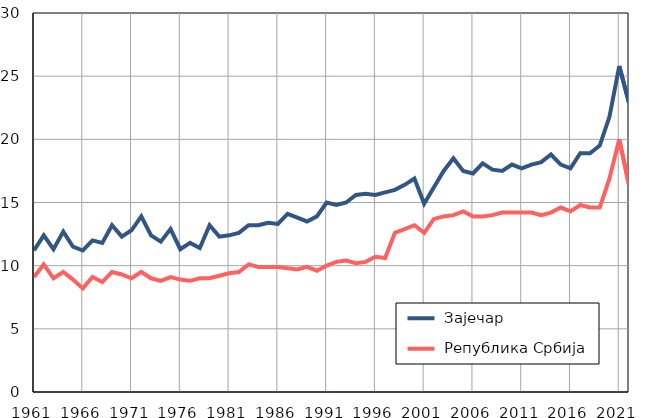
| Category |  Зајечар |  Република Србија |
|---|---|---|
| 1961.0 | 11.2 | 9.1 |
| 1962.0 | 12.4 | 10.1 |
| 1963.0 | 11.3 | 9 |
| 1964.0 | 12.7 | 9.5 |
| 1965.0 | 11.5 | 8.9 |
| 1966.0 | 11.2 | 8.2 |
| 1967.0 | 12 | 9.1 |
| 1968.0 | 11.8 | 8.7 |
| 1969.0 | 13.2 | 9.5 |
| 1970.0 | 12.3 | 9.3 |
| 1971.0 | 12.8 | 9 |
| 1972.0 | 13.9 | 9.5 |
| 1973.0 | 12.4 | 9 |
| 1974.0 | 11.9 | 8.8 |
| 1975.0 | 12.9 | 9.1 |
| 1976.0 | 11.3 | 8.9 |
| 1977.0 | 11.8 | 8.8 |
| 1978.0 | 11.4 | 9 |
| 1979.0 | 13.2 | 9 |
| 1980.0 | 12.3 | 9.2 |
| 1981.0 | 12.4 | 9.4 |
| 1982.0 | 12.6 | 9.5 |
| 1983.0 | 13.2 | 10.1 |
| 1984.0 | 13.2 | 9.9 |
| 1985.0 | 13.4 | 9.9 |
| 1986.0 | 13.3 | 9.9 |
| 1987.0 | 14.1 | 9.8 |
| 1988.0 | 13.8 | 9.7 |
| 1989.0 | 13.5 | 9.9 |
| 1990.0 | 13.9 | 9.6 |
| 1991.0 | 15 | 10 |
| 1992.0 | 14.8 | 10.3 |
| 1993.0 | 15 | 10.4 |
| 1994.0 | 15.6 | 10.2 |
| 1995.0 | 15.7 | 10.3 |
| 1996.0 | 15.6 | 10.7 |
| 1997.0 | 15.8 | 10.6 |
| 1998.0 | 16 | 12.6 |
| 1999.0 | 16.4 | 12.9 |
| 2000.0 | 16.9 | 13.2 |
| 2001.0 | 14.9 | 12.6 |
| 2002.0 | 16.2 | 13.7 |
| 2003.0 | 17.5 | 13.9 |
| 2004.0 | 18.5 | 14 |
| 2005.0 | 17.5 | 14.3 |
| 2006.0 | 17.3 | 13.9 |
| 2007.0 | 18.1 | 13.9 |
| 2008.0 | 17.6 | 14 |
| 2009.0 | 17.5 | 14.2 |
| 2010.0 | 18 | 14.2 |
| 2011.0 | 17.7 | 14.2 |
| 2012.0 | 18 | 14.2 |
| 2013.0 | 18.2 | 14 |
| 2014.0 | 18.8 | 14.2 |
| 2015.0 | 18 | 14.6 |
| 2016.0 | 17.7 | 14.3 |
| 2017.0 | 18.9 | 14.8 |
| 2018.0 | 18.9 | 14.6 |
| 2019.0 | 19.5 | 14.6 |
| 2020.0 | 21.8 | 16.9 |
| 2021.0 | 25.8 | 20 |
| 2022.0 | 22.9 | 16.4 |